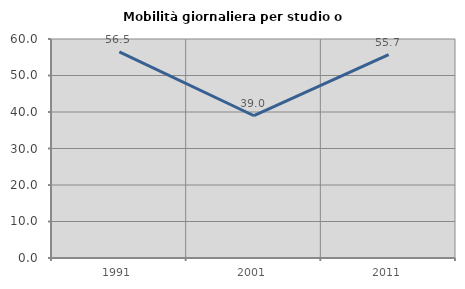
| Category | Mobilità giornaliera per studio o lavoro |
|---|---|
| 1991.0 | 56.478 |
| 2001.0 | 38.976 |
| 2011.0 | 55.738 |